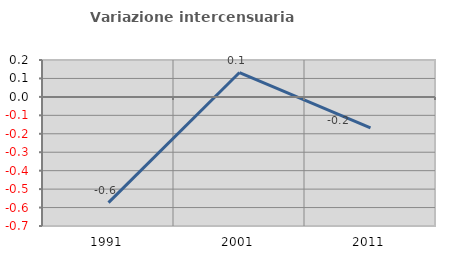
| Category | Variazione intercensuaria annua |
|---|---|
| 1991.0 | -0.573 |
| 2001.0 | 0.132 |
| 2011.0 | -0.168 |